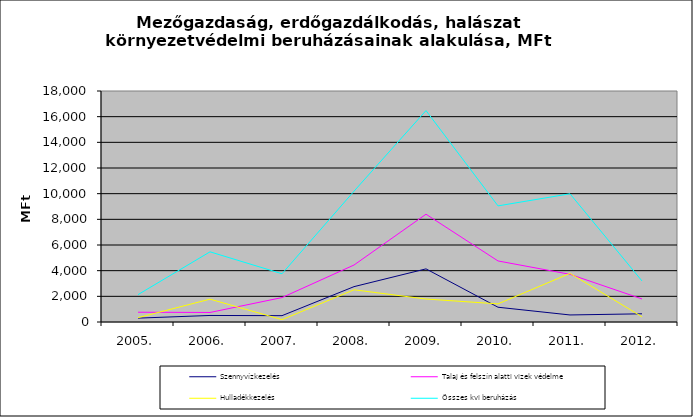
| Category | Szennyvízkezelés | Talaj és felszín alatti vizek védelme | Hulladékkezelés | Összes kvi beruházás |
|---|---|---|---|---|
| 2005. | 300.886 | 761.061 | 336.066 | 2131.962 |
| 2006. | 510.106 | 742.513 | 1781.042 | 5467.033 |
| 2007. | 494.22 | 1903.492 | 187.152 | 3759.487 |
| 2008. | 2754.321 | 4439.826 | 2509.608 | 10192.793 |
| 2009. | 4140.557 | 8398.948 | 1790.537 | 16475.49 |
| 2010. | 1151.276 | 4757.37 | 1411.52 | 9048.477 |
| 2011. | 548.301 | 3714.208 | 3787.721 | 9990.062 |
| 2012. | 638.871 | 1796.159 | 407.221 | 3196.978 |